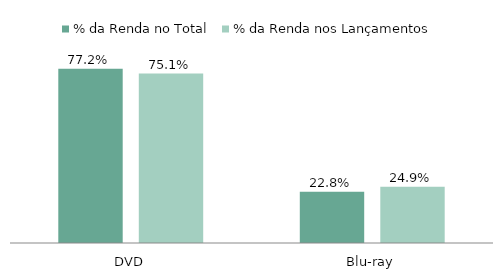
| Category | % da Renda no Total | % da Renda nos Lançamentos |
|---|---|---|
| DVD | 0.772 | 0.751 |
| Blu-ray | 0.228 | 0.249 |